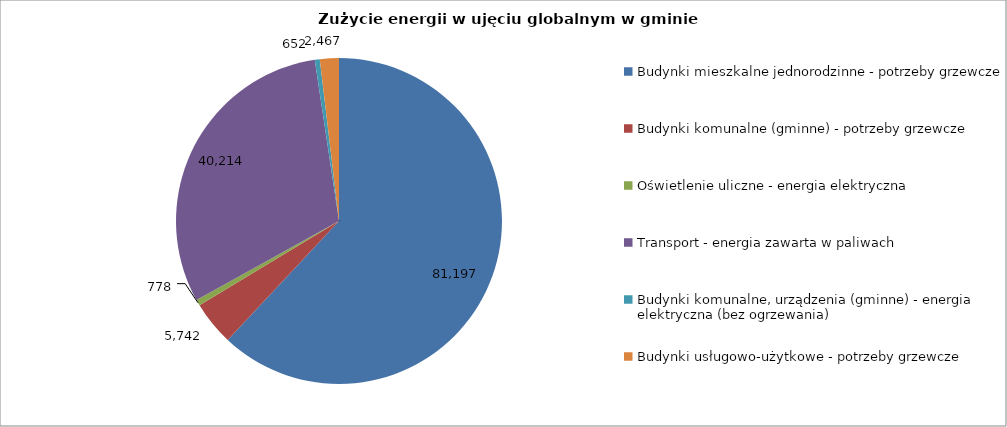
| Category | Series 0 |
|---|---|
| Budynki mieszkalne jednorodzinne - potrzeby grzewcze | 81196.962 |
| Budynki komunalne (gminne) - potrzeby grzewcze | 5742.097 |
| Oświetlenie uliczne - energia elektryczna  | 777.83 |
| Transport - energia zawarta w paliwach | 40213.85 |
| Budynki komunalne, urządzenia (gminne) - energia elektryczna (bez ogrzewania) | 651.932 |
| Budynki usługowo-użytkowe - potrzeby grzewcze | 2466.906 |